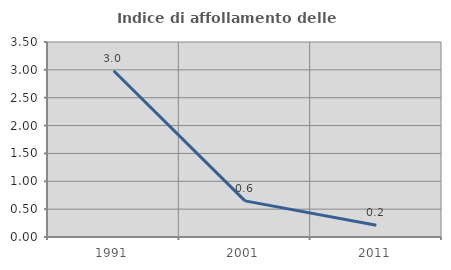
| Category | Indice di affollamento delle abitazioni  |
|---|---|
| 1991.0 | 2.983 |
| 2001.0 | 0.648 |
| 2011.0 | 0.213 |